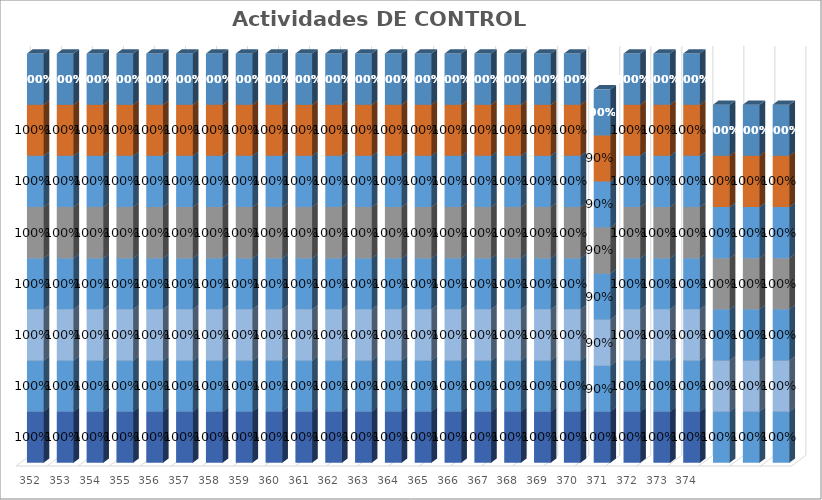
| Category | % Avance |
|---|---|
| 352.0 | 1 |
| 353.0 | 1 |
| 354.0 | 1 |
| 355.0 | 1 |
| 356.0 | 1 |
| 357.0 | 1 |
| 358.0 | 1 |
| 359.0 | 1 |
| 360.0 | 1 |
| 361.0 | 1 |
| 362.0 | 1 |
| 363.0 | 1 |
| 364.0 | 1 |
| 365.0 | 1 |
| 366.0 | 1 |
| 367.0 | 1 |
| 368.0 | 1 |
| 369.0 | 1 |
| 370.0 | 1 |
| 371.0 | 0.9 |
| 372.0 | 1 |
| 373.0 | 1 |
| 374.0 | 1 |